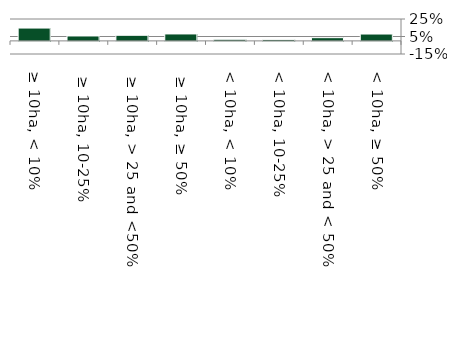
| Category | Native |
|---|---|
|  ≥ 10ha, < 10%  | 0.146 |
|   ≥ 10ha, 10-25% | 0.056 |
|   ≥ 10ha, > 25 and <50%  | 0.064 |
|   ≥ 10ha, ≥ 50%  | 0.079 |
|  < 10ha, < 10% | 0.018 |
|  < 10ha, 10-25% | 0.017 |
|  < 10ha, > 25 and < 50% | 0.037 |
|  < 10ha, ≥ 50% | 0.078 |